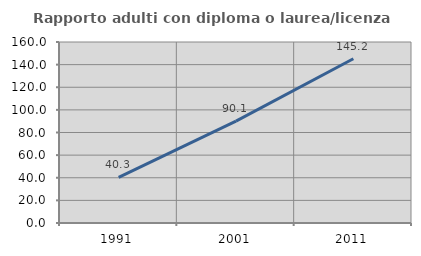
| Category | Rapporto adulti con diploma o laurea/licenza media  |
|---|---|
| 1991.0 | 40.303 |
| 2001.0 | 90.075 |
| 2011.0 | 145.194 |